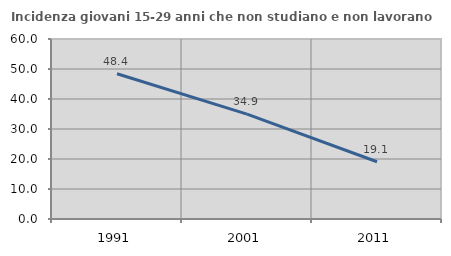
| Category | Incidenza giovani 15-29 anni che non studiano e non lavorano  |
|---|---|
| 1991.0 | 48.404 |
| 2001.0 | 34.946 |
| 2011.0 | 19.084 |